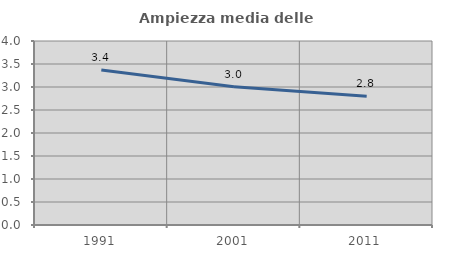
| Category | Ampiezza media delle famiglie |
|---|---|
| 1991.0 | 3.367 |
| 2001.0 | 3.006 |
| 2011.0 | 2.797 |